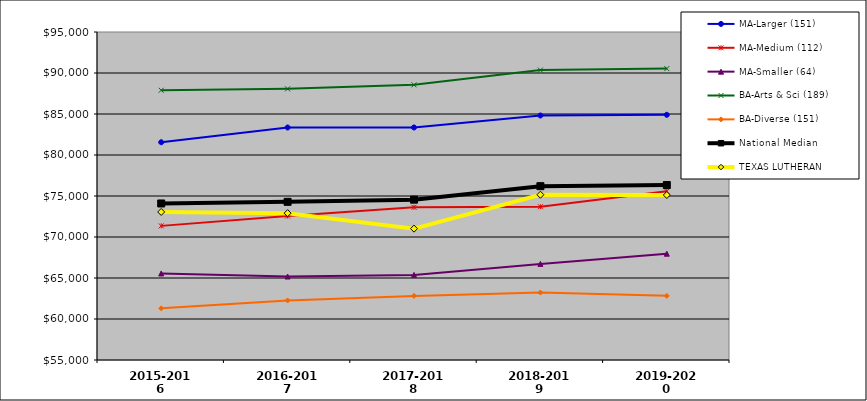
| Category | MA-Larger (151) | MA-Medium (112) | MA-Smaller (64) | BA-Arts & Sci (189) | BA-Diverse (151) | National Median | TEXAS LUTHERAN |
|---|---|---|---|---|---|---|---|
| 2015-2016 | 81558 | 71356.5 | 65556 | 87894 | 61299 | 74088 | 73053 |
| 2016-2017 | 83355 | 72553.5 | 65181 | 88065 | 62260 | 74288 | 72909 |
| 2017-2018 | 83357 | 73622 | 65378 | 88555 | 62816 | 74555 | 71021 |
| 2018-2019 | 84815 | 73691 | 66719 | 90356 | 63223 | 76199 | 75154 |
| 2019-2020 | 84902 | 75575 | 67961.5 | 90534 | 62822 | 76337 | 75120 |